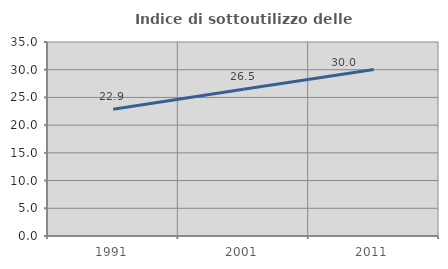
| Category | Indice di sottoutilizzo delle abitazioni  |
|---|---|
| 1991.0 | 22.855 |
| 2001.0 | 26.482 |
| 2011.0 | 30.036 |